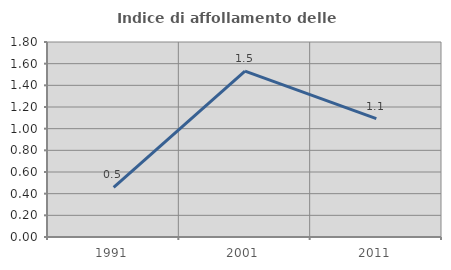
| Category | Indice di affollamento delle abitazioni  |
|---|---|
| 1991.0 | 0.459 |
| 2001.0 | 1.531 |
| 2011.0 | 1.093 |